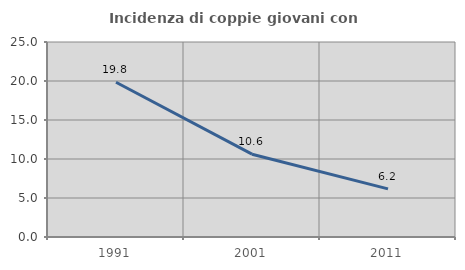
| Category | Incidenza di coppie giovani con figli |
|---|---|
| 1991.0 | 19.84 |
| 2001.0 | 10.616 |
| 2011.0 | 6.173 |